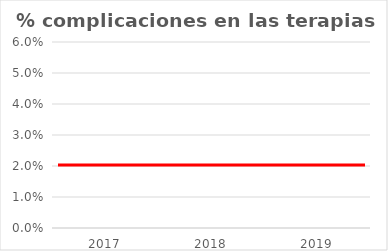
| Category | Series 0 |
|---|---|
| 2017.0 | 0 |
| 2018.0 | 0 |
| 2019.0 | 0 |